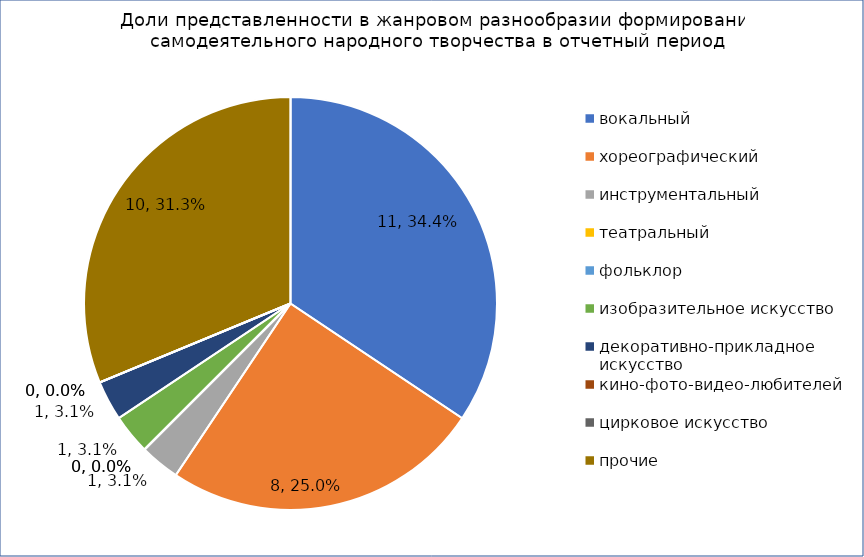
| Category | Series 2 |
|---|---|
| вокальный | 11 |
| хореографический | 8 |
| инструментальный | 1 |
| театральный | 0 |
| фольклор | 0 |
| изобразительное искусство | 1 |
| декоративно-прикладное искусство | 1 |
| кино-фото-видео-любителей | 0 |
| цирковое искусство | 0 |
| прочие | 10 |